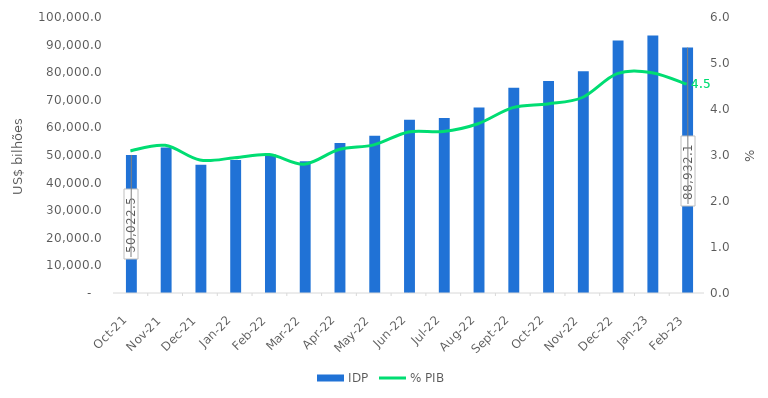
| Category | IDP |
|---|---|
| 2021-10-01 | 50022.5 |
| 2021-11-01 | 52720.6 |
| 2021-12-01 | 46439 |
| 2022-01-01 | 48145.8 |
| 2022-02-01 | 50201.3 |
| 2022-03-01 | 47711.5 |
| 2022-04-01 | 54313.5 |
| 2022-05-01 | 56979.1 |
| 2022-06-01 | 62732.9 |
| 2022-07-01 | 63384.5 |
| 2022-08-01 | 67208.2 |
| 2022-09-01 | 74349.9 |
| 2022-10-01 | 76786.7 |
| 2022-11-01 | 80344.4 |
| 2022-12-01 | 91502.1 |
| 2023-01-01 | 93274.5 |
| 2023-02-01 | 88932.1 |